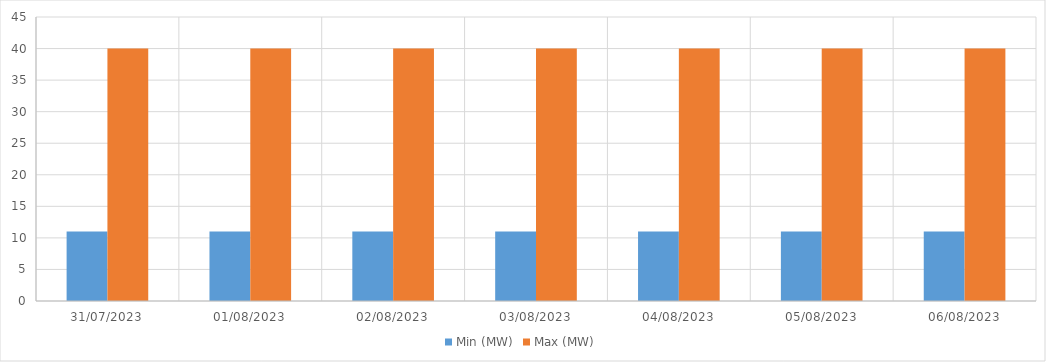
| Category | Min (MW) | Max (MW) |
|---|---|---|
| 31/07/2023 | 11 | 40 |
| 01/08/2023 | 11 | 40 |
| 02/08/2023 | 11 | 40 |
| 03/08/2023 | 11 | 40 |
| 04/08/2023 | 11 | 40 |
| 05/08/2023 | 11 | 40 |
| 06/08/2023 | 11 | 40 |